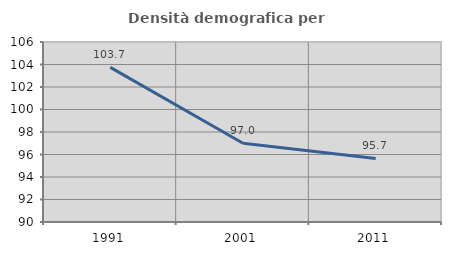
| Category | Densità demografica |
|---|---|
| 1991.0 | 103.743 |
| 2001.0 | 96.999 |
| 2011.0 | 95.653 |